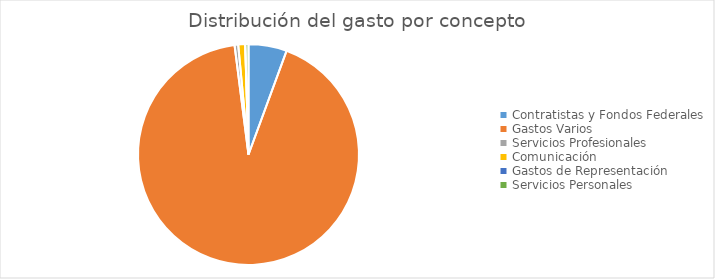
| Category | Series 0 |
|---|---|
| Contratistas y Fondos Federales | 18649514.07 |
| Gastos Varios | 307546587.45 |
| Servicios Profesionales | 1778276.09 |
| Comunicación | 3364132.34 |
| Gastos de Representación | 32547.84 |
| Servicios Personales | 1561107.31 |